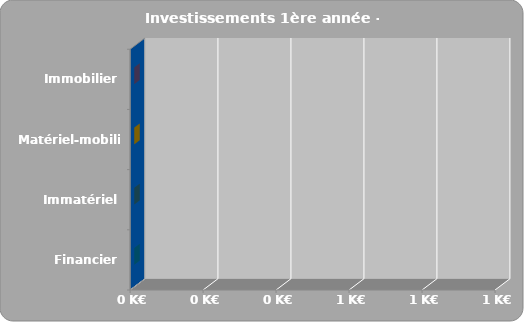
| Category | Series 0 |
|---|---|
| Financier | 0 |
| Immatériel | 0 |
| Matériel-mobilier | 0 |
| Immobilier | 0 |